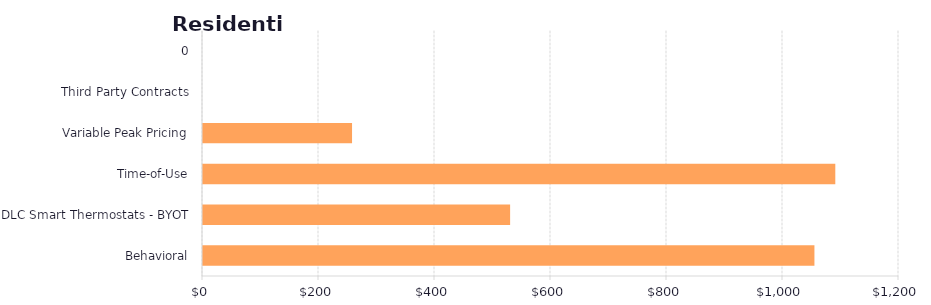
| Category | Series 1 |
|---|---|
| Behavioral | 1054.195 |
| DLC Smart Thermostats - BYOT | 529.518 |
| Time-of-Use | 1090.177 |
| Variable Peak Pricing | 256.971 |
| Third Party Contracts | 0 |
| 0 | 0 |